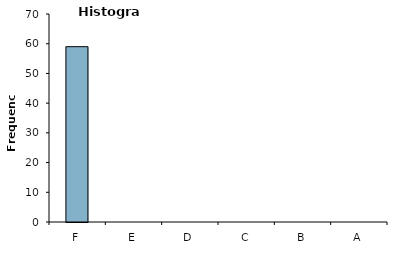
| Category | Grade |
|---|---|
| F | 59 |
| E | 0 |
| D | 0 |
| C | 0 |
| B | 0 |
| A | 0 |